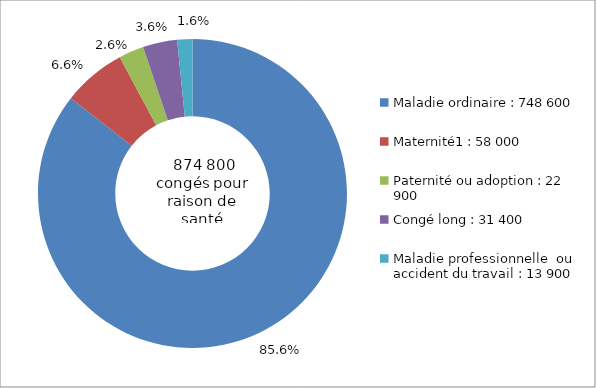
| Category | Series 0 |
|---|---|
| Maladie ordinaire : 748 600 | 0.856 |
| Maternité1 : 58 000 | 0.066 |
| Paternité ou adoption : 22 900 | 0.026 |
| Congé long : 31 400 | 0.036 |
| Maladie professionnelle  ou accident du travail : 13 900 | 0.016 |